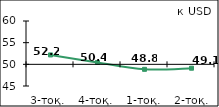
| Category | Диффузиялық индекс* |
|---|---|
| 3-тоқ. | 52.17 |
| 4-тоқ. | 50.42 |
| 1-тоқ. 2010  | 48.845 |
| 2-тоқ. күту | 49.105 |